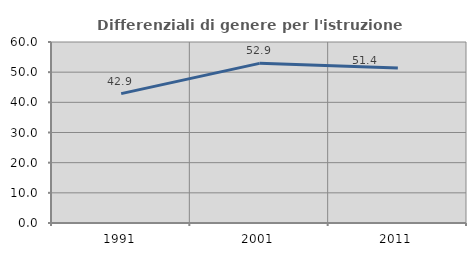
| Category | Differenziali di genere per l'istruzione superiore |
|---|---|
| 1991.0 | 42.887 |
| 2001.0 | 52.918 |
| 2011.0 | 51.405 |